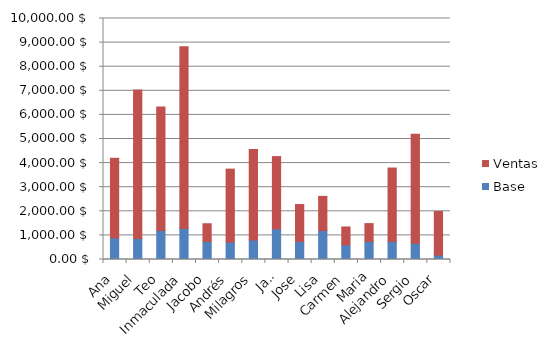
| Category | Base | Ventas |
|---|---|---|
| Ana | 900 | 3300 |
| Miguel | 870 | 6160 |
| Teo | 1200 | 5130 |
| Inmaculada | 1290 | 7541 |
| Jacobo | 750 | 734 |
| Andrés | 720 | 3030 |
| Milagros | 810 | 3758 |
| Javi | 1270 | 3000 |
| Jose | 750 | 1530 |
| Lisa | 1200 | 1420 |
| Carmen | 610 | 740 |
| Maria | 750 | 740 |
| Alejandro | 750 | 3045 |
| Sergio | 670 | 4530 |
| Oscar | 180 | 1810 |